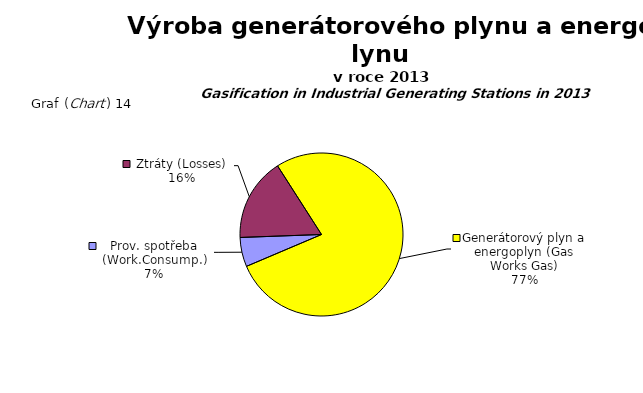
| Category | Series 0 |
|---|---|
| Prov. spotřeba (Work.Consump.) | 185776 |
| Ztráty (Losses) | 528809 |
| Generátorový plyn a energoplyn (Gas Works Gas) | 2486165 |